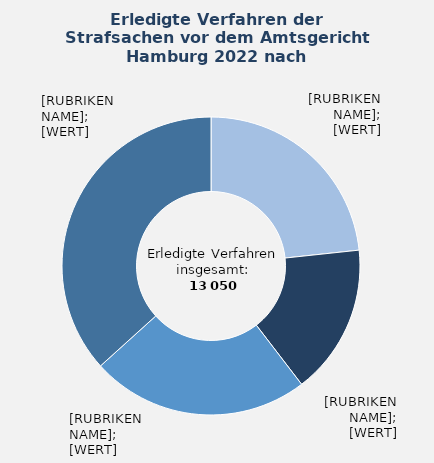
| Category | in Prozent |
|---|---|
| Eigentums- und Vermögensdelikte | 23.3 |
| Straftaten gegen das Leben und gegen die körperliche Unversehrtheit | 16.3 |
| Sonstige allgemeine Straftaten | 23.7 |
| Übrige Sachgebiete¹ | 36.7 |